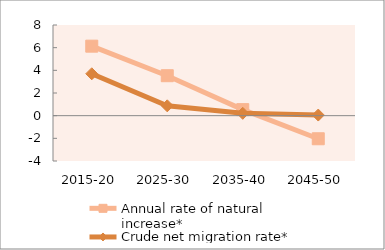
| Category | Annual rate of natural increase* | Crude net migration rate* |
|---|---|---|
| 2015-20 | 6.132 | 3.696 |
| 2025-30 | 3.525 | 0.869 |
| 2035-40 | 0.533 | 0.207 |
| 2045-50 | -2.038 | 0.054 |